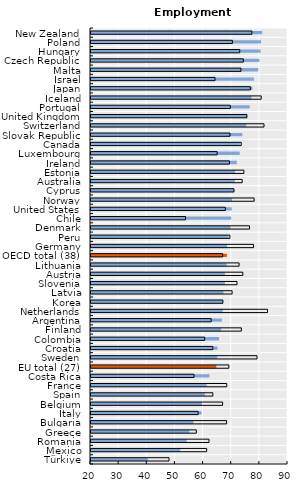
| Category | Foreign-born | Native-born |
|---|---|---|
| Türkiye | 40.178 | 47.723 |
| Mexico | 51.7 | 61.1 |
| Romania | 54.021 | 61.926 |
| Greece | 54.896 | 57.431 |
| Bulgaria | 56.415 | 68.187 |
| Italy | 59.28 | 58.079 |
| Belgium | 59.395 | 66.766 |
| Spain | 60.436 | 63.299 |
| France | 61.122 | 68.225 |
| Costa Rica | 62.1 | 56.6 |
| EU total (27) | 64.517 | 68.985 |
| Sweden | 64.862 | 78.992 |
| Croatia | 64.947 | 63.285 |
| Colombia | 65.5 | 60.4 |
| Finland | 66.227 | 73.433 |
| Argentina | 66.5 | 62.7 |
| Netherlands | 66.831 | 82.717 |
| Korea | 66.905 | 66.864 |
| Latvia | 67.064 | 70.138 |
| Slovenia | 67.619 | 71.882 |
| Austria | 67.624 | 73.945 |
| Lithuania | 68.175 | 72.619 |
| OECD total (38) | 68.305 | 66.783 |
| Germany | 68.312 | 77.76 |
| Peru | 68.829 | 69.356 |
| Denmark | 69.605 | 76.326 |
| Chile | 69.8 | 53.6 |
| United States | 70.03 | 67.75 |
| Norway | 70.16 | 77.968 |
| Cyprus | 70.776 | 70.805 |
| Australia | 71.134 | 73.723 |
| Estonia | 71.162 | 74.325 |
| Ireland | 71.828 | 69.201 |
| Luxembourg | 72.841 | 64.822 |
| Canada | 72.875 | 73.378 |
| Slovak Republic | 73.746 | 69.397 |
| Switzerland | 75.198 | 81.47 |
| United Kingdom | 75.482 | 75.387 |
| Portugal | 76.396 | 69.501 |
| Iceland | 77.031 | 80.482 |
| Japan | 77.362 | 76.613 |
| Israel | 77.88 | 64.07 |
| Malta | 79.425 | 73.283 |
| Czech Republic | 79.807 | 74.138 |
| Hungary | 80.28 | 72.847 |
| Poland | 80.419 | 70.237 |
| New Zealand | 80.825 | 77.17 |